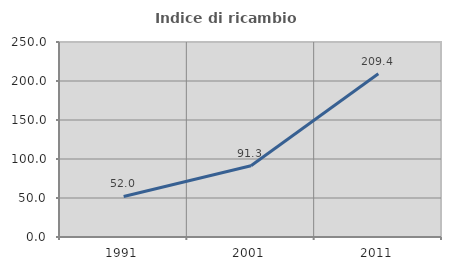
| Category | Indice di ricambio occupazionale  |
|---|---|
| 1991.0 | 52.014 |
| 2001.0 | 91.348 |
| 2011.0 | 209.358 |